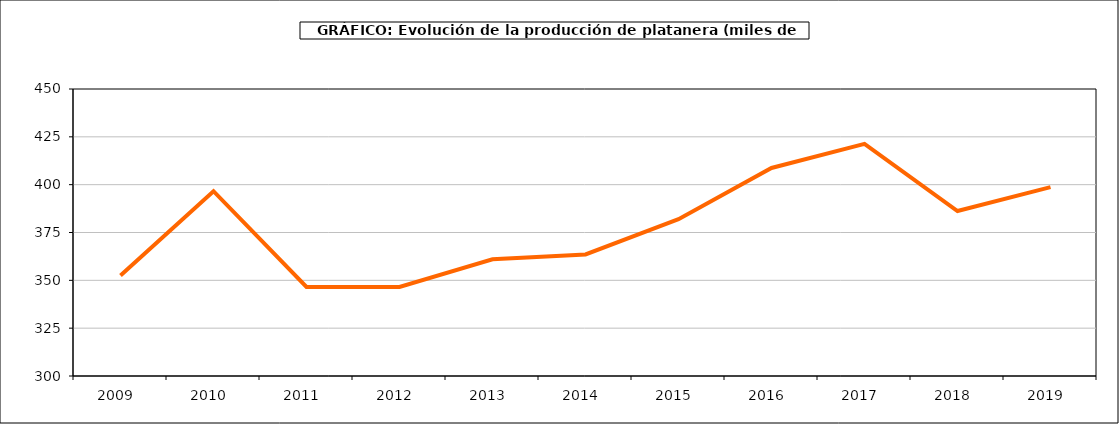
| Category | producción platanera |
|---|---|
| 2009.0 | 352.522 |
| 2010.0 | 396.589 |
| 2011.0 | 346.509 |
| 2012.0 | 346.509 |
| 2013.0 | 360.987 |
| 2014.0 | 363.552 |
| 2015.0 | 381.983 |
| 2016.0 | 408.716 |
| 2017.0 | 421.313 |
| 2018.0 | 386.226 |
| 2019.0 | 398.722 |